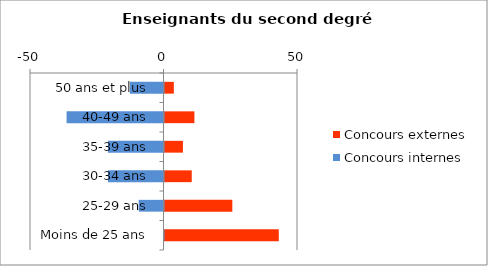
| Category | Concours externes | Concours internes |
|---|---|---|
| 50 ans et plus | 3.5 | -12.6 |
| 40-49 ans | 11.2 | -36.3 |
| 35-39 ans | 6.9 | -20.8 |
| 30-34 ans | 10.2 | -20.8 |
| 25-29 ans | 25.4 | -9.3 |
| Moins de 25 ans | 42.8 | -0.2 |